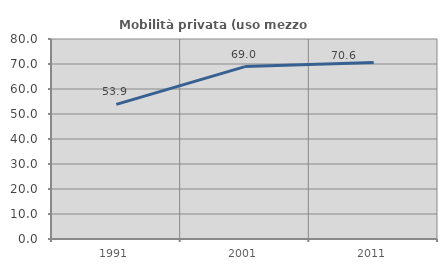
| Category | Mobilità privata (uso mezzo privato) |
|---|---|
| 1991.0 | 53.856 |
| 2001.0 | 68.974 |
| 2011.0 | 70.588 |